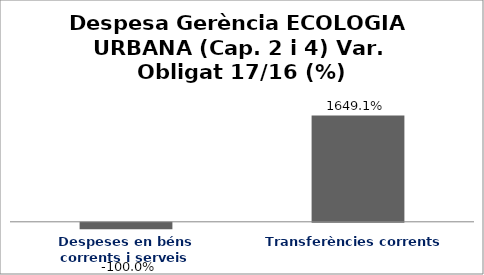
| Category | Series 0 |
|---|---|
| Despeses en béns corrents i serveis | -1 |
| Transferències corrents | 16.491 |